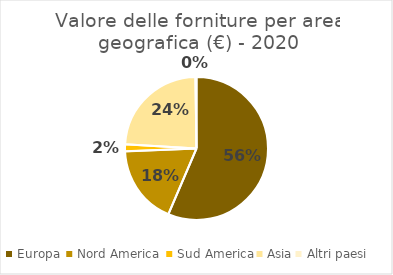
| Category | Series 0 |
|---|---|
| Europa  | 747028764 |
| Nord America  | 237376285 |
| Sud America | 21024009 |
| Asia | 315020934 |
| Altri paesi | 3252957 |